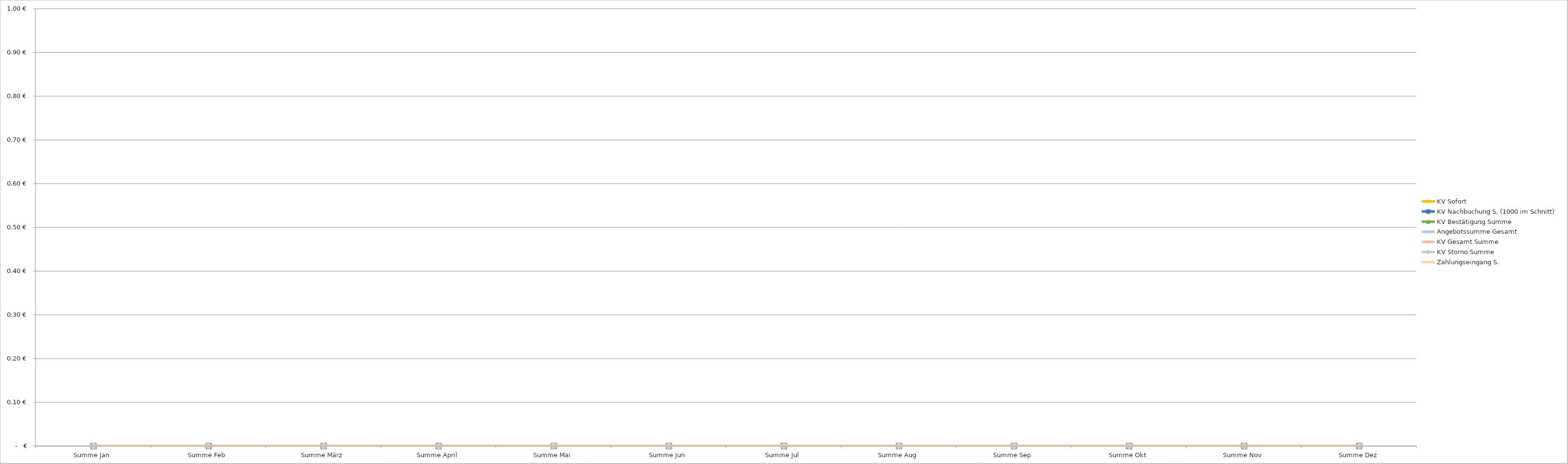
| Category | KV Sofort  | KV Nachbuchung S. (1000 im Schnitt) | KV Bestätigung Summe | Angebotssumme Gesamt | KV Gesamt Summe | KV Storno Summe | Zahlungseingang S. |
|---|---|---|---|---|---|---|---|
| Summe Jan | 0 | 0 | 0 | 0 | 0 | 0 | 0 |
| Summe Feb | 0 | 0 | 0 | 0 | 0 | 0 | 0 |
| Summe März | 0 | 0 | 0 | 0 | 0 | 0 | 0 |
| Summe April | 0 | 0 | 0 | 0 | 0 | 0 | 0 |
| Summe Mai | 0 | 0 | 0 | 0 | 0 | 0 | 0 |
| Summe Jun | 0 | 0 | 0 | 0 | 0 | 0 | 0 |
| Summe Jul | 0 | 0 | 0 | 0 | 0 | 0 | 0 |
| Summe Aug | 0 | 0 | 0 | 0 | 0 | 0 | 0 |
| Summe Sep | 0 | 0 | 0 | 0 | 0 | 0 | 0 |
| Summe Okt | 0 | 0 | 0 | 0 | 0 | 0 | 0 |
| Summe Nov | 0 | 0 | 0 | 0 | 0 | 0 | 0 |
| Summe Dez | 0 | 0 | 0 | 0 | 0 | 0 | 0 |